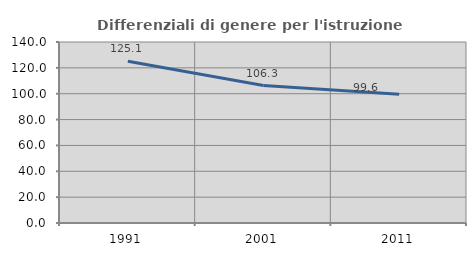
| Category | Differenziali di genere per l'istruzione superiore |
|---|---|
| 1991.0 | 125.065 |
| 2001.0 | 106.305 |
| 2011.0 | 99.591 |